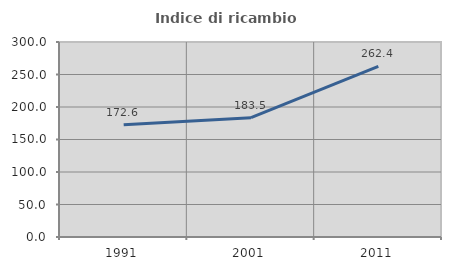
| Category | Indice di ricambio occupazionale  |
|---|---|
| 1991.0 | 172.581 |
| 2001.0 | 183.495 |
| 2011.0 | 262.353 |